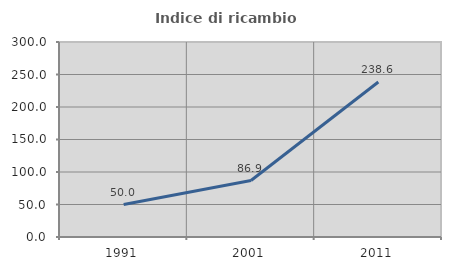
| Category | Indice di ricambio occupazionale  |
|---|---|
| 1991.0 | 50 |
| 2001.0 | 86.851 |
| 2011.0 | 238.551 |